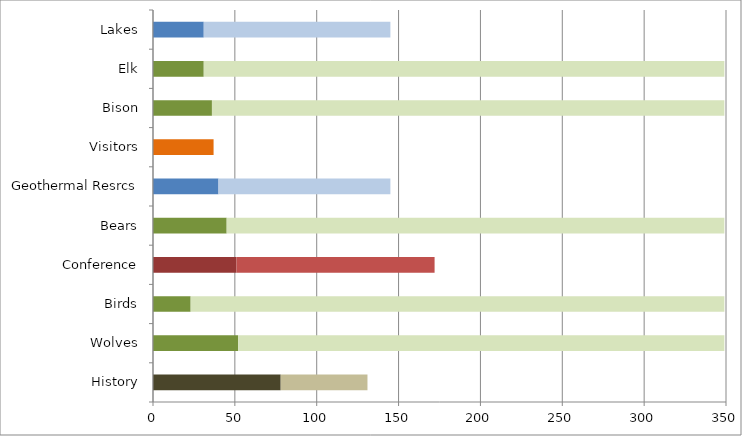
| Category | Topic | Branch Total |
|---|---|---|
| History | 78 | 53 |
| Wolves | 52 | 297 |
| Birds | 23 | 326 |
| Conference | 51 | 121 |
| Bears | 45 | 304 |
| Geothermal Resrcs | 40 | 105 |
| Visitors | 37 | 0 |
| Bison | 36 | 313 |
| Elk | 31 | 318 |
| Lakes | 31 | 114 |